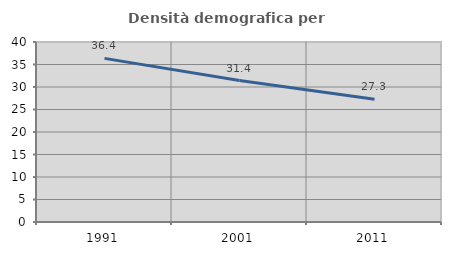
| Category | Densità demografica |
|---|---|
| 1991.0 | 36.364 |
| 2001.0 | 31.442 |
| 2011.0 | 27.257 |